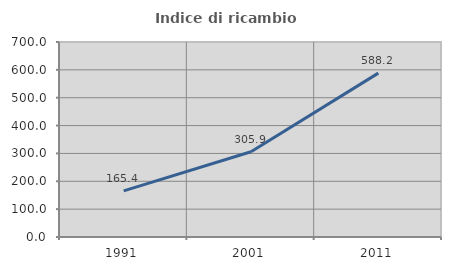
| Category | Indice di ricambio occupazionale  |
|---|---|
| 1991.0 | 165.385 |
| 2001.0 | 305.882 |
| 2011.0 | 588.235 |